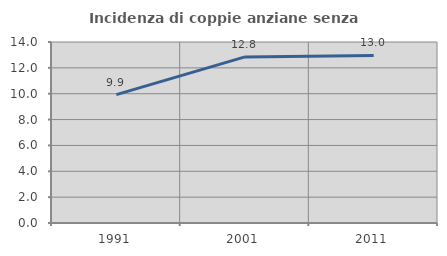
| Category | Incidenza di coppie anziane senza figli  |
|---|---|
| 1991.0 | 9.927 |
| 2001.0 | 12.846 |
| 2011.0 | 12.963 |